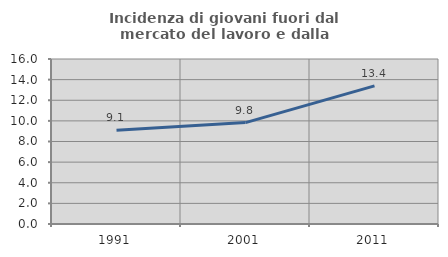
| Category | Incidenza di giovani fuori dal mercato del lavoro e dalla formazione  |
|---|---|
| 1991.0 | 9.091 |
| 2001.0 | 9.832 |
| 2011.0 | 13.393 |